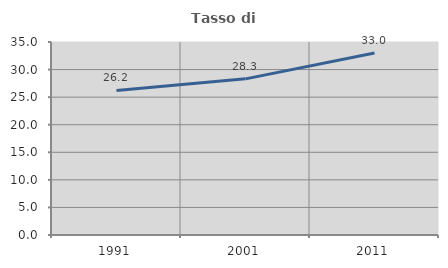
| Category | Tasso di occupazione   |
|---|---|
| 1991.0 | 26.219 |
| 2001.0 | 28.317 |
| 2011.0 | 32.998 |